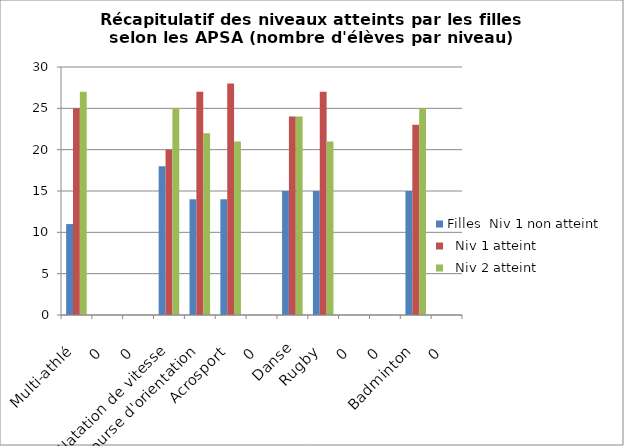
| Category | Filles Niv 1 non atteint | Filles Niv 1 atteint | Filles Niv 2 atteint |
|---|---|---|---|
| Multi-athlé | 11 | 25 | 27 |
| 0 | 0 | 0 | 0 |
| 0 | 0 | 0 | 0 |
| Natation de vitesse | 18 | 20 | 25 |
| Course d'orientation | 14 | 27 | 22 |
| Acrosport | 14 | 28 | 21 |
| 0 | 0 | 0 | 0 |
| Danse | 15 | 24 | 24 |
| Rugby | 15 | 27 | 21 |
| 0 | 0 | 0 | 0 |
| 0 | 0 | 0 | 0 |
| Badminton | 15 | 23 | 25 |
| 0 | 0 | 0 | 0 |